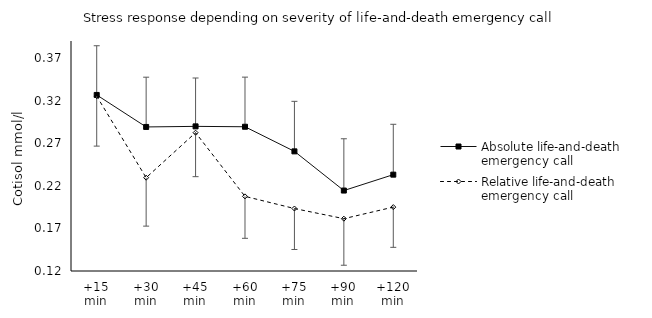
| Category | Absolute life-and-death emergency call | Relative life-and-death emergency call |
|---|---|---|
| +15 min | 0.327 | 0.325 |
| +30 min | 0.289 | 0.23 |
| +45 min | 0.29 | 0.282 |
| +60 min | 0.289 | 0.208 |
| +75 min | 0.26 | 0.193 |
| +90 min | 0.214 | 0.181 |
| +120 min | 0.233 | 0.195 |